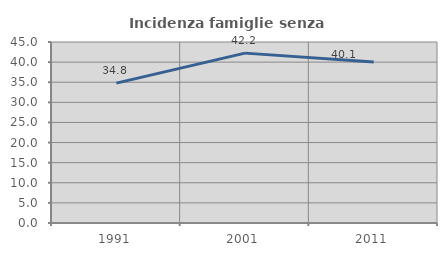
| Category | Incidenza famiglie senza nuclei |
|---|---|
| 1991.0 | 34.769 |
| 2001.0 | 42.234 |
| 2011.0 | 40.05 |